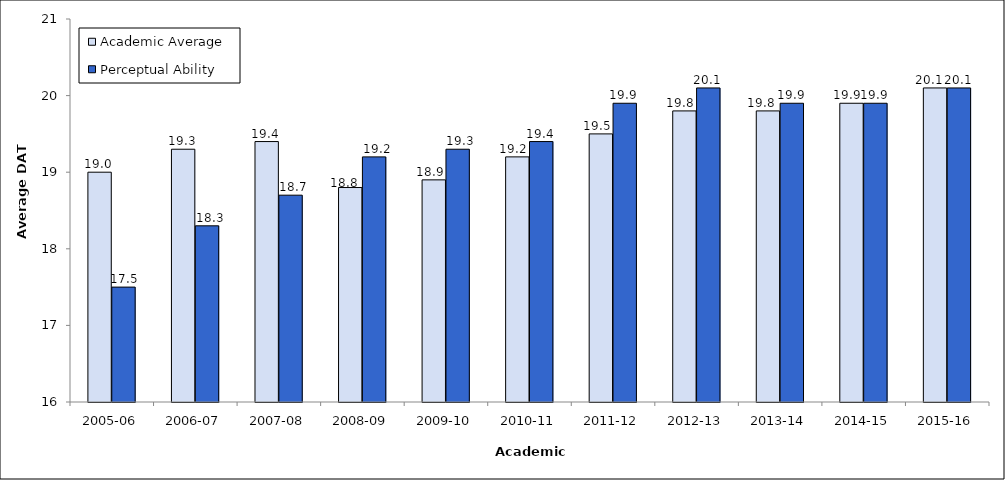
| Category | Academic Average | Perceptual Ability |
|---|---|---|
| 2005-06 | 19 | 17.5 |
| 2006-07 | 19.3 | 18.3 |
| 2007-08 | 19.4 | 18.7 |
| 2008-09 | 18.8 | 19.2 |
| 2009-10 | 18.9 | 19.3 |
| 2010-11 | 19.2 | 19.4 |
| 2011-12 | 19.5 | 19.9 |
| 2012-13 | 19.8 | 20.1 |
| 2013-14 | 19.8 | 19.9 |
| 2014-15 | 19.9 | 19.9 |
| 2015-16 | 20.1 | 20.1 |